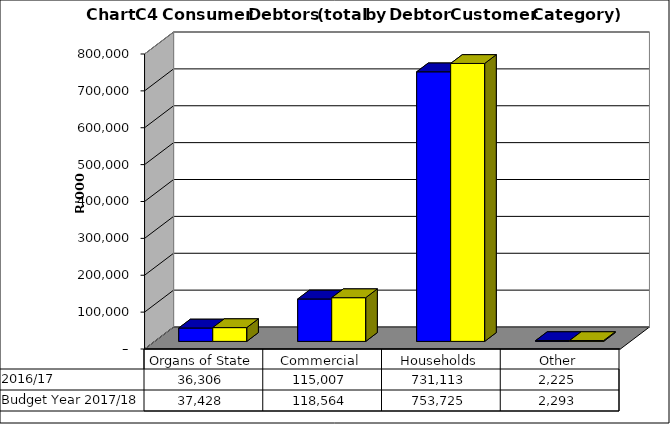
| Category |  2016/17  | Budget Year 2017/18 |
|---|---|---|
| Organs of State | 36305527.979 | 37428379.36 |
| Commercial | 115006896.786 | 118563811.12 |
| Households | 731113315.708 | 753725067.74 |
| Other | 2224514.755 | 2293314.18 |